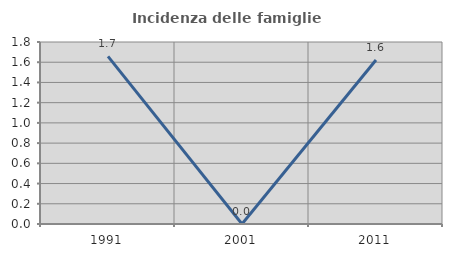
| Category | Incidenza delle famiglie numerose |
|---|---|
| 1991.0 | 1.657 |
| 2001.0 | 0 |
| 2011.0 | 1.622 |